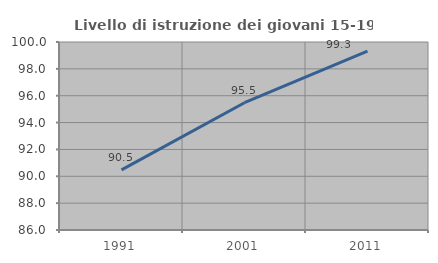
| Category | Livello di istruzione dei giovani 15-19 anni |
|---|---|
| 1991.0 | 90.476 |
| 2001.0 | 95.48 |
| 2011.0 | 99.315 |